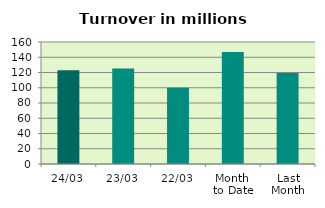
| Category | Series 0 |
|---|---|
| 24/03 | 123.089 |
| 23/03 | 125.308 |
| 22/03 | 100.138 |
| Month 
to Date | 146.997 |
| Last
Month | 119.242 |